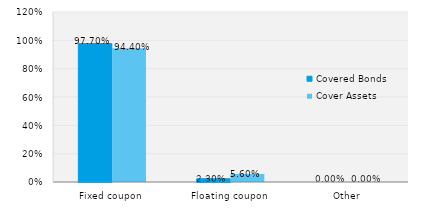
| Category | Covered Bonds | Cover Assets |
|---|---|---|
| Fixed coupon | 0.977 | 0.944 |
| Floating coupon | 0.023 | 0.056 |
| Other | 0 | 0 |